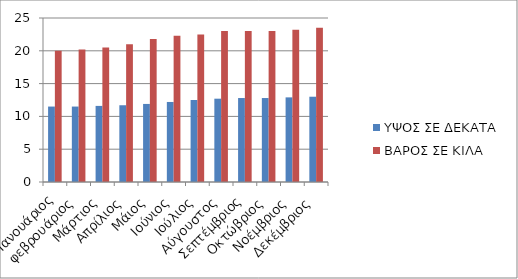
| Category | ΥΨΟΣ ΣΕ ΔΕΚΑΤΑ | ΒΑΡΟΣ ΣΕ ΚΙΛΑ |
|---|---|---|
| Ιανουάριος | 11.5 | 20 |
| φεβρουάριος | 11.5 | 20.2 |
| Μάρτιος | 11.6 | 20.5 |
| Απρίλιος | 11.7 | 21 |
| Μάιος | 11.9 | 21.8 |
| Ιούνιος | 12.2 | 22.3 |
| Ιούλιος | 12.5 | 22.5 |
| Αύγουστος | 12.7 | 23 |
| Σεπτέμβριος | 12.8 | 23 |
| Οκτώβριος | 12.8 | 23 |
| Νοέμβριος | 12.9 | 23.2 |
| Δεκέμβριος | 13 | 23.5 |